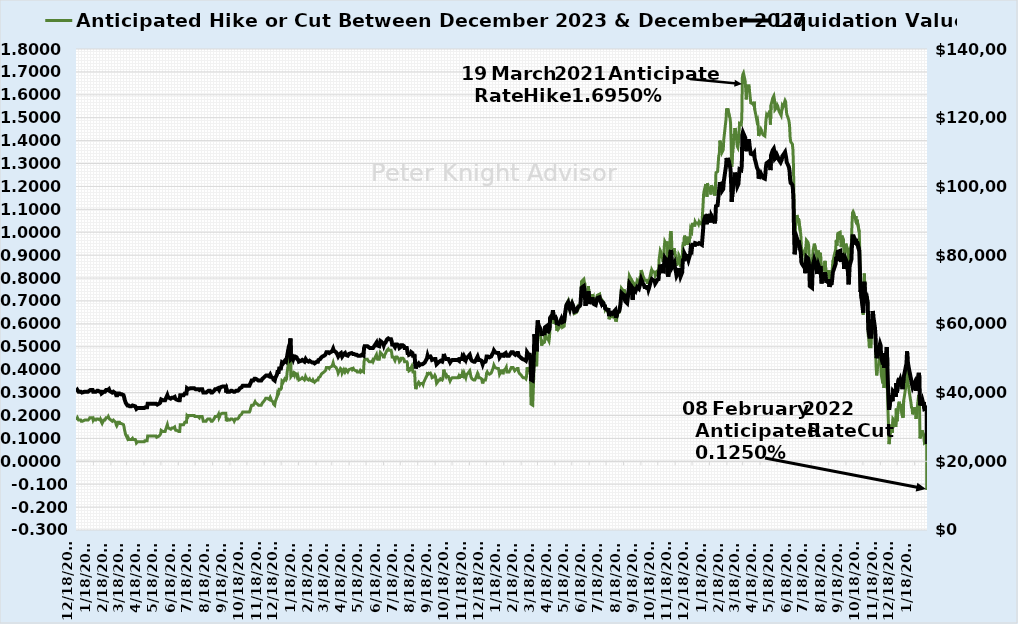
| Category | Anticipated Hike or Cut Between December 2023 & December 2027 |
|---|---|
| 12/18/17 | 0.18 |
| 12/19/17 | 0.18 |
| 12/20/17 | 0.19 |
| 12/21/17 | 0.185 |
| 12/22/17 | 0.18 |
| 12/26/17 | 0.18 |
| 12/27/17 | 0.175 |
| 12/28/17 | 0.175 |
| 12/29/17 | 0.175 |
| 1/2/18 | 0.18 |
| 1/3/18 | 0.18 |
| 1/4/18 | 0.18 |
| 1/5/18 | 0.18 |
| 1/8/18 | 0.18 |
| 1/9/18 | 0.18 |
| 1/10/18 | 0.185 |
| 1/11/18 | 0.19 |
| 1/12/18 | 0.19 |
| 1/16/18 | 0.19 |
| 1/17/18 | 0.18 |
| 1/18/18 | 0.185 |
| 1/19/18 | 0.18 |
| 1/22/18 | 0.18 |
| 1/23/18 | 0.185 |
| 1/24/18 | 0.185 |
| 1/25/18 | 0.185 |
| 1/26/18 | 0.185 |
| 1/29/18 | 0.18 |
| 1/30/18 | 0.185 |
| 1/31/18 | 0.18 |
| 2/1/18 | 0.17 |
| 2/2/18 | 0.165 |
| 2/5/18 | 0.18 |
| 2/6/18 | 0.18 |
| 2/7/18 | 0.18 |
| 2/8/18 | 0.185 |
| 2/9/18 | 0.19 |
| 2/12/18 | 0.19 |
| 2/13/18 | 0.195 |
| 2/14/18 | 0.195 |
| 2/15/18 | 0.185 |
| 2/16/18 | 0.185 |
| 2/20/18 | 0.175 |
| 2/21/18 | 0.175 |
| 2/22/18 | 0.18 |
| 2/23/18 | 0.18 |
| 2/26/18 | 0.17 |
| 2/27/18 | 0.16 |
| 2/28/18 | 0.155 |
| 3/1/18 | 0.16 |
| 3/2/18 | 0.17 |
| 3/5/18 | 0.17 |
| 3/6/18 | 0.165 |
| 3/7/18 | 0.165 |
| 3/8/18 | 0.165 |
| 3/9/18 | 0.165 |
| 3/12/18 | 0.16 |
| 3/13/18 | 0.15 |
| 3/14/18 | 0.135 |
| 3/15/18 | 0.125 |
| 3/16/18 | 0.115 |
| 3/19/18 | 0.1 |
| 3/20/18 | 0.105 |
| 3/21/18 | 0.1 |
| 3/22/18 | 0.095 |
| 3/23/18 | 0.095 |
| 3/26/18 | 0.095 |
| 3/27/18 | 0.095 |
| 3/28/18 | 0.1 |
| 3/29/18 | 0.095 |
| 4/2/18 | 0.095 |
| 4/3/18 | 0.09 |
| 4/4/18 | 0.08 |
| 4/5/18 | 0.08 |
| 4/6/18 | 0.085 |
| 4/9/18 | 0.085 |
| 4/10/18 | 0.085 |
| 4/11/18 | 0.085 |
| 4/12/18 | 0.085 |
| 4/13/18 | 0.085 |
| 4/16/18 | 0.085 |
| 4/17/18 | 0.085 |
| 4/18/18 | 0.085 |
| 4/19/18 | 0.09 |
| 4/20/18 | 0.09 |
| 4/23/18 | 0.09 |
| 4/24/18 | 0.11 |
| 4/25/18 | 0.11 |
| 4/26/18 | 0.11 |
| 4/27/18 | 0.11 |
| 4/30/18 | 0.11 |
| 5/1/18 | 0.11 |
| 5/2/18 | 0.11 |
| 5/3/18 | 0.11 |
| 5/4/18 | 0.11 |
| 5/7/18 | 0.11 |
| 5/8/18 | 0.11 |
| 5/9/18 | 0.11 |
| 5/10/18 | 0.105 |
| 5/11/18 | 0.105 |
| 5/14/18 | 0.11 |
| 5/15/18 | 0.11 |
| 5/16/18 | 0.115 |
| 5/17/18 | 0.12 |
| 5/18/18 | 0.135 |
| 5/21/18 | 0.13 |
| 5/22/18 | 0.13 |
| 5/23/18 | 0.13 |
| 5/24/18 | 0.13 |
| 5/25/18 | 0.13 |
| 5/29/18 | 0.16 |
| 5/30/18 | 0.15 |
| 5/31/18 | 0.145 |
| 6/1/18 | 0.145 |
| 6/4/18 | 0.14 |
| 6/5/18 | 0.14 |
| 6/6/18 | 0.145 |
| 6/7/18 | 0.145 |
| 6/8/18 | 0.145 |
| 6/11/18 | 0.15 |
| 6/12/18 | 0.14 |
| 6/13/18 | 0.135 |
| 6/14/18 | 0.135 |
| 6/15/18 | 0.135 |
| 6/18/18 | 0.13 |
| 6/19/18 | 0.13 |
| 6/20/18 | 0.13 |
| 6/21/18 | 0.16 |
| 6/22/18 | 0.16 |
| 6/25/18 | 0.16 |
| 6/26/18 | 0.16 |
| 6/27/18 | 0.16 |
| 6/28/18 | 0.165 |
| 6/29/18 | 0.17 |
| 7/2/18 | 0.17 |
| 7/3/18 | 0.2 |
| 7/5/18 | 0.195 |
| 7/6/18 | 0.2 |
| 7/9/18 | 0.2 |
| 7/10/18 | 0.2 |
| 7/11/18 | 0.2 |
| 7/12/18 | 0.2 |
| 7/13/18 | 0.2 |
| 7/16/18 | 0.2 |
| 7/17/18 | 0.195 |
| 7/18/18 | 0.195 |
| 7/19/18 | 0.195 |
| 7/20/18 | 0.195 |
| 7/23/18 | 0.195 |
| 7/24/18 | 0.195 |
| 7/25/18 | 0.19 |
| 7/26/18 | 0.195 |
| 7/27/18 | 0.195 |
| 7/30/18 | 0.195 |
| 7/31/18 | 0.195 |
| 8/1/18 | 0.175 |
| 8/2/18 | 0.175 |
| 8/3/18 | 0.175 |
| 8/6/18 | 0.175 |
| 8/7/18 | 0.18 |
| 8/8/18 | 0.18 |
| 8/9/18 | 0.185 |
| 8/10/18 | 0.185 |
| 8/13/18 | 0.185 |
| 8/14/18 | 0.18 |
| 8/15/18 | 0.175 |
| 8/16/18 | 0.175 |
| 8/17/18 | 0.175 |
| 8/20/18 | 0.185 |
| 8/21/18 | 0.185 |
| 8/22/18 | 0.195 |
| 8/23/18 | 0.195 |
| 8/24/18 | 0.195 |
| 8/27/18 | 0.2 |
| 8/28/18 | 0.205 |
| 8/29/18 | 0.19 |
| 8/30/18 | 0.195 |
| 8/31/18 | 0.205 |
| 9/4/18 | 0.21 |
| 9/5/18 | 0.21 |
| 9/6/18 | 0.21 |
| 9/7/18 | 0.21 |
| 9/10/18 | 0.21 |
| 9/11/18 | 0.175 |
| 9/12/18 | 0.19 |
| 9/13/18 | 0.18 |
| 9/14/18 | 0.18 |
| 9/17/18 | 0.18 |
| 9/18/18 | 0.18 |
| 9/19/18 | 0.185 |
| 9/20/18 | 0.185 |
| 9/21/18 | 0.185 |
| 9/24/18 | 0.18 |
| 9/25/18 | 0.175 |
| 9/26/18 | 0.18 |
| 9/27/18 | 0.185 |
| 9/28/18 | 0.185 |
| 10/1/18 | 0.185 |
| 10/2/18 | 0.185 |
| 10/3/18 | 0.19 |
| 10/4/18 | 0.195 |
| 10/5/18 | 0.2 |
| 10/8/18 | 0.205 |
| 10/9/18 | 0.21 |
| 10/10/18 | 0.215 |
| 10/11/18 | 0.215 |
| 10/12/18 | 0.215 |
| 10/15/18 | 0.215 |
| 10/16/18 | 0.215 |
| 10/17/18 | 0.215 |
| 10/18/18 | 0.215 |
| 10/19/18 | 0.215 |
| 10/22/18 | 0.215 |
| 10/23/18 | 0.22 |
| 10/24/18 | 0.23 |
| 10/25/18 | 0.23 |
| 10/26/18 | 0.245 |
| 10/29/18 | 0.245 |
| 10/30/18 | 0.25 |
| 10/31/18 | 0.255 |
| 11/1/18 | 0.26 |
| 11/2/18 | 0.255 |
| 11/5/18 | 0.25 |
| 11/6/18 | 0.25 |
| 11/7/18 | 0.245 |
| 11/8/18 | 0.245 |
| 11/9/18 | 0.245 |
| 11/12/18 | 0.245 |
| 11/13/18 | 0.25 |
| 11/14/18 | 0.255 |
| 11/15/18 | 0.255 |
| 11/16/18 | 0.26 |
| 11/19/18 | 0.27 |
| 11/20/18 | 0.275 |
| 11/21/18 | 0.275 |
| 11/23/18 | 0.275 |
| 11/26/18 | 0.27 |
| 11/27/18 | 0.275 |
| 11/28/18 | 0.28 |
| 11/29/18 | 0.275 |
| 11/30/18 | 0.265 |
| 12/3/18 | 0.26 |
| 12/4/18 | 0.25 |
| 12/5/18 | 0.25 |
| 12/6/18 | 0.245 |
| 12/7/18 | 0.26 |
| 12/10/18 | 0.28 |
| 12/11/18 | 0.295 |
| 12/12/18 | 0.29 |
| 12/13/18 | 0.295 |
| 12/14/18 | 0.315 |
| 12/17/18 | 0.315 |
| 12/18/18 | 0.32 |
| 12/19/18 | 0.35 |
| 12/20/18 | 0.35 |
| 12/21/18 | 0.345 |
| 12/24/18 | 0.36 |
| 12/26/18 | 0.355 |
| 12/27/18 | 0.36 |
| 12/28/18 | 0.385 |
| 12/31/18 | 0.44 |
| 1/2/19 | 0.46 |
| 1/3/19 | 0.49 |
| 1/4/19 | 0.37 |
| 1/7/19 | 0.38 |
| 1/8/19 | 0.37 |
| 1/9/19 | 0.38 |
| 1/10/19 | 0.375 |
| 1/11/19 | 0.385 |
| 1/14/19 | 0.38 |
| 1/15/19 | 0.37 |
| 1/16/19 | 0.375 |
| 1/17/19 | 0.365 |
| 1/18/19 | 0.355 |
| 1/22/19 | 0.36 |
| 1/23/19 | 0.36 |
| 1/24/19 | 0.365 |
| 1/25/19 | 0.365 |
| 1/28/19 | 0.355 |
| 1/29/19 | 0.36 |
| 1/30/19 | 0.37 |
| 1/31/19 | 0.365 |
| 2/1/19 | 0.36 |
| 2/4/19 | 0.355 |
| 2/5/19 | 0.355 |
| 2/6/19 | 0.36 |
| 2/7/19 | 0.355 |
| 2/8/19 | 0.355 |
| 2/11/19 | 0.35 |
| 2/12/19 | 0.355 |
| 2/13/19 | 0.35 |
| 2/14/19 | 0.35 |
| 2/15/19 | 0.345 |
| 2/19/19 | 0.355 |
| 2/20/19 | 0.355 |
| 2/21/19 | 0.355 |
| 2/22/19 | 0.365 |
| 2/25/19 | 0.37 |
| 2/26/19 | 0.375 |
| 2/27/19 | 0.38 |
| 2/28/19 | 0.38 |
| 3/1/19 | 0.385 |
| 3/4/19 | 0.39 |
| 3/5/19 | 0.39 |
| 3/6/19 | 0.395 |
| 3/7/19 | 0.4 |
| 3/8/19 | 0.41 |
| 3/11/19 | 0.41 |
| 3/12/19 | 0.41 |
| 3/13/19 | 0.405 |
| 3/14/19 | 0.41 |
| 3/15/19 | 0.41 |
| 3/18/19 | 0.415 |
| 3/19/19 | 0.415 |
| 3/20/19 | 0.43 |
| 3/21/19 | 0.42 |
| 3/22/19 | 0.415 |
| 3/25/19 | 0.41 |
| 3/26/19 | 0.41 |
| 3/27/19 | 0.4 |
| 3/28/19 | 0.395 |
| 3/29/19 | 0.385 |
| 4/1/19 | 0.4 |
| 4/2/19 | 0.405 |
| 4/3/19 | 0.405 |
| 4/4/19 | 0.4 |
| 4/5/19 | 0.385 |
| 4/8/19 | 0.4 |
| 4/9/19 | 0.395 |
| 4/10/19 | 0.405 |
| 4/11/19 | 0.395 |
| 4/12/19 | 0.4 |
| 4/15/19 | 0.39 |
| 4/16/19 | 0.395 |
| 4/17/19 | 0.4 |
| 4/18/19 | 0.4 |
| 4/22/19 | 0.405 |
| 4/23/19 | 0.4 |
| 4/24/19 | 0.4 |
| 4/25/19 | 0.405 |
| 4/26/19 | 0.4 |
| 4/29/19 | 0.395 |
| 4/30/19 | 0.395 |
| 5/1/19 | 0.395 |
| 5/2/19 | 0.39 |
| 5/3/19 | 0.39 |
| 5/6/19 | 0.39 |
| 5/7/19 | 0.395 |
| 5/8/19 | 0.39 |
| 5/9/19 | 0.39 |
| 5/10/19 | 0.395 |
| 5/13/19 | 0.39 |
| 5/14/19 | 0.435 |
| 5/15/19 | 0.445 |
| 5/16/19 | 0.445 |
| 5/17/19 | 0.445 |
| 5/20/19 | 0.445 |
| 5/21/19 | 0.44 |
| 5/22/19 | 0.44 |
| 5/23/19 | 0.435 |
| 5/24/19 | 0.435 |
| 5/28/19 | 0.435 |
| 5/29/19 | 0.44 |
| 5/30/19 | 0.435 |
| 5/31/19 | 0.44 |
| 6/3/19 | 0.455 |
| 6/4/19 | 0.46 |
| 6/5/19 | 0.465 |
| 6/6/19 | 0.45 |
| 6/7/19 | 0.445 |
| 6/10/19 | 0.445 |
| 6/11/19 | 0.445 |
| 6/12/19 | 0.475 |
| 6/13/19 | 0.475 |
| 6/14/19 | 0.47 |
| 6/17/19 | 0.46 |
| 6/18/19 | 0.45 |
| 6/19/19 | 0.46 |
| 6/20/19 | 0.465 |
| 6/21/19 | 0.465 |
| 6/24/19 | 0.485 |
| 6/25/19 | 0.485 |
| 6/26/19 | 0.49 |
| 6/27/19 | 0.485 |
| 6/28/19 | 0.485 |
| 7/1/19 | 0.485 |
| 7/2/19 | 0.475 |
| 7/3/19 | 0.455 |
| 7/5/19 | 0.455 |
| 7/8/19 | 0.44 |
| 7/9/19 | 0.44 |
| 7/10/19 | 0.455 |
| 7/11/19 | 0.455 |
| 7/12/19 | 0.455 |
| 7/15/19 | 0.445 |
| 7/16/19 | 0.435 |
| 7/17/19 | 0.435 |
| 7/18/19 | 0.44 |
| 7/19/19 | 0.45 |
| 7/22/19 | 0.45 |
| 7/23/19 | 0.45 |
| 7/24/19 | 0.445 |
| 7/25/19 | 0.435 |
| 7/26/19 | 0.435 |
| 7/29/19 | 0.435 |
| 7/30/19 | 0.43 |
| 7/31/19 | 0.395 |
| 8/1/19 | 0.41 |
| 8/2/19 | 0.395 |
| 8/5/19 | 0.4 |
| 8/6/19 | 0.41 |
| 8/7/19 | 0.415 |
| 8/8/19 | 0.405 |
| 8/9/19 | 0.39 |
| 8/12/19 | 0.39 |
| 8/13/19 | 0.335 |
| 8/14/19 | 0.315 |
| 8/15/19 | 0.315 |
| 8/16/19 | 0.335 |
| 8/19/19 | 0.345 |
| 8/20/19 | 0.345 |
| 8/21/19 | 0.335 |
| 8/22/19 | 0.34 |
| 8/23/19 | 0.34 |
| 8/26/19 | 0.34 |
| 8/27/19 | 0.335 |
| 8/28/19 | 0.345 |
| 8/29/19 | 0.35 |
| 8/30/19 | 0.35 |
| 9/3/19 | 0.375 |
| 9/4/19 | 0.39 |
| 9/5/19 | 0.38 |
| 9/6/19 | 0.38 |
| 9/9/19 | 0.385 |
| 9/10/19 | 0.38 |
| 9/11/19 | 0.375 |
| 9/12/19 | 0.365 |
| 9/13/19 | 0.365 |
| 9/16/19 | 0.37 |
| 9/17/19 | 0.375 |
| 9/18/19 | 0.37 |
| 9/19/19 | 0.355 |
| 9/20/19 | 0.34 |
| 9/23/19 | 0.35 |
| 9/24/19 | 0.355 |
| 9/25/19 | 0.355 |
| 9/26/19 | 0.355 |
| 9/27/19 | 0.36 |
| 9/30/19 | 0.355 |
| 10/1/19 | 0.36 |
| 10/2/19 | 0.375 |
| 10/3/19 | 0.4 |
| 10/4/19 | 0.385 |
| 10/7/19 | 0.37 |
| 10/8/19 | 0.375 |
| 10/9/19 | 0.37 |
| 10/10/19 | 0.37 |
| 10/11/19 | 0.37 |
| 10/14/19 | 0.35 |
| 10/15/19 | 0.35 |
| 10/16/19 | 0.36 |
| 10/17/19 | 0.36 |
| 10/18/19 | 0.365 |
| 10/21/19 | 0.365 |
| 10/22/19 | 0.365 |
| 10/23/19 | 0.365 |
| 10/24/19 | 0.365 |
| 10/25/19 | 0.365 |
| 10/28/19 | 0.365 |
| 10/29/19 | 0.37 |
| 10/30/19 | 0.36 |
| 10/31/19 | 0.38 |
| 11/1/19 | 0.37 |
| 11/4/19 | 0.37 |
| 11/5/19 | 0.385 |
| 11/6/19 | 0.38 |
| 11/7/19 | 0.375 |
| 11/8/19 | 0.385 |
| 11/11/19 | 0.365 |
| 11/12/19 | 0.375 |
| 11/13/19 | 0.38 |
| 11/14/19 | 0.38 |
| 11/15/19 | 0.385 |
| 11/18/19 | 0.395 |
| 11/19/19 | 0.385 |
| 11/20/19 | 0.37 |
| 11/21/19 | 0.37 |
| 11/22/19 | 0.36 |
| 11/25/19 | 0.355 |
| 11/26/19 | 0.355 |
| 11/27/19 | 0.355 |
| 11/29/19 | 0.365 |
| 12/2/19 | 0.385 |
| 12/3/19 | 0.38 |
| 12/4/19 | 0.365 |
| 12/5/19 | 0.365 |
| 12/6/19 | 0.365 |
| 12/9/19 | 0.36 |
| 12/10/19 | 0.35 |
| 12/11/19 | 0.34 |
| 12/12/19 | 0.35 |
| 12/13/19 | 0.355 |
| 12/16/19 | 0.355 |
| 12/17/19 | 0.365 |
| 12/18/19 | 0.385 |
| 12/19/19 | 0.39 |
| 12/20/19 | 0.385 |
| 12/23/19 | 0.38 |
| 12/24/19 | 0.38 |
| 12/26/19 | 0.385 |
| 12/27/19 | 0.39 |
| 12/30/19 | 0.41 |
| 12/31/19 | 0.42 |
| 1/2/20 | 0.41 |
| 1/3/20 | 0.41 |
| 1/6/20 | 0.405 |
| 1/7/20 | 0.405 |
| 1/8/20 | 0.405 |
| 1/9/20 | 0.395 |
| 1/10/20 | 0.38 |
| 1/13/20 | 0.395 |
| 1/14/20 | 0.395 |
| 1/15/20 | 0.395 |
| 1/16/20 | 0.38 |
| 1/17/20 | 0.395 |
| 1/21/20 | 0.405 |
| 1/22/20 | 0.41 |
| 1/23/20 | 0.39 |
| 1/24/20 | 0.39 |
| 1/27/20 | 0.39 |
| 1/28/20 | 0.395 |
| 1/29/20 | 0.4 |
| 1/30/20 | 0.405 |
| 1/31/20 | 0.41 |
| 2/3/20 | 0.41 |
| 2/4/20 | 0.405 |
| 2/5/20 | 0.4 |
| 2/6/20 | 0.395 |
| 2/7/20 | 0.395 |
| 2/10/20 | 0.405 |
| 2/11/20 | 0.405 |
| 2/12/20 | 0.405 |
| 2/13/20 | 0.39 |
| 2/14/20 | 0.385 |
| 2/18/20 | 0.375 |
| 2/19/20 | 0.37 |
| 2/20/20 | 0.37 |
| 2/21/20 | 0.365 |
| 2/24/20 | 0.365 |
| 2/25/20 | 0.365 |
| 2/26/20 | 0.36 |
| 2/27/20 | 0.37 |
| 2/28/20 | 0.41 |
| 3/2/20 | 0.395 |
| 3/3/20 | 0.395 |
| 3/4/20 | 0.395 |
| 3/5/20 | 0.38 |
| 3/6/20 | 0.25 |
| 3/9/20 | 0.245 |
| 3/10/20 | 0.305 |
| 3/11/20 | 0.38 |
| 3/12/20 | 0.515 |
| 3/13/20 | 0.5 |
| 3/16/20 | 0.415 |
| 3/17/20 | 0.55 |
| 3/18/20 | 0.595 |
| 3/19/20 | 0.57 |
| 3/20/20 | 0.57 |
| 3/23/20 | 0.545 |
| 3/24/20 | 0.525 |
| 3/25/20 | 0.505 |
| 3/26/20 | 0.52 |
| 3/27/20 | 0.515 |
| 3/30/20 | 0.52 |
| 3/31/20 | 0.555 |
| 4/1/20 | 0.56 |
| 4/2/20 | 0.56 |
| 4/3/20 | 0.535 |
| 4/6/20 | 0.53 |
| 4/7/20 | 0.525 |
| 4/8/20 | 0.545 |
| 4/9/20 | 0.61 |
| 4/13/20 | 0.63 |
| 4/14/20 | 0.655 |
| 4/15/20 | 0.62 |
| 4/16/20 | 0.6 |
| 4/17/20 | 0.625 |
| 4/20/20 | 0.6 |
| 4/21/20 | 0.57 |
| 4/22/20 | 0.58 |
| 4/23/20 | 0.575 |
| 4/24/20 | 0.575 |
| 4/27/20 | 0.59 |
| 4/28/20 | 0.59 |
| 4/29/20 | 0.605 |
| 4/30/20 | 0.6 |
| 5/1/20 | 0.585 |
| 5/4/20 | 0.59 |
| 5/5/20 | 0.59 |
| 5/6/20 | 0.645 |
| 5/7/20 | 0.65 |
| 5/8/20 | 0.685 |
| 5/11/20 | 0.7 |
| 5/12/20 | 0.685 |
| 5/13/20 | 0.67 |
| 5/14/20 | 0.66 |
| 5/15/20 | 0.675 |
| 5/18/20 | 0.695 |
| 5/19/20 | 0.695 |
| 5/20/20 | 0.68 |
| 5/21/20 | 0.66 |
| 5/22/20 | 0.645 |
| 5/26/20 | 0.65 |
| 5/27/20 | 0.65 |
| 5/28/20 | 0.67 |
| 5/29/20 | 0.665 |
| 6/1/20 | 0.68 |
| 6/2/20 | 0.69 |
| 6/3/20 | 0.74 |
| 6/4/20 | 0.785 |
| 6/5/20 | 0.785 |
| 6/8/20 | 0.795 |
| 6/9/20 | 0.78 |
| 6/10/20 | 0.775 |
| 6/11/20 | 0.68 |
| 6/12/20 | 0.72 |
| 6/15/20 | 0.725 |
| 6/16/20 | 0.765 |
| 6/17/20 | 0.74 |
| 6/18/20 | 0.69 |
| 6/19/20 | 0.705 |
| 6/22/20 | 0.71 |
| 6/23/20 | 0.73 |
| 6/24/20 | 0.71 |
| 6/25/20 | 0.715 |
| 6/26/20 | 0.69 |
| 6/29/20 | 0.685 |
| 6/30/20 | 0.7 |
| 7/1/20 | 0.715 |
| 7/2/20 | 0.725 |
| 7/6/20 | 0.73 |
| 7/7/20 | 0.71 |
| 7/8/20 | 0.705 |
| 7/9/20 | 0.695 |
| 7/10/20 | 0.705 |
| 7/13/20 | 0.695 |
| 7/14/20 | 0.675 |
| 7/15/20 | 0.685 |
| 7/16/20 | 0.665 |
| 7/17/20 | 0.67 |
| 7/20/20 | 0.655 |
| 7/21/20 | 0.66 |
| 7/22/20 | 0.655 |
| 7/23/20 | 0.62 |
| 7/24/20 | 0.63 |
| 7/27/20 | 0.635 |
| 7/28/20 | 0.625 |
| 7/29/20 | 0.65 |
| 7/30/20 | 0.64 |
| 7/31/20 | 0.635 |
| 8/3/20 | 0.655 |
| 8/4/20 | 0.61 |
| 8/5/20 | 0.615 |
| 8/6/20 | 0.63 |
| 8/7/20 | 0.645 |
| 8/10/20 | 0.65 |
| 8/11/20 | 0.665 |
| 8/12/20 | 0.685 |
| 8/13/20 | 0.72 |
| 8/14/20 | 0.755 |
| 8/17/20 | 0.745 |
| 8/18/20 | 0.73 |
| 8/19/20 | 0.75 |
| 8/20/20 | 0.715 |
| 8/21/20 | 0.705 |
| 8/24/20 | 0.695 |
| 8/25/20 | 0.72 |
| 8/26/20 | 0.715 |
| 8/27/20 | 0.78 |
| 8/28/20 | 0.81 |
| 8/31/20 | 0.795 |
| 9/1/20 | 0.765 |
| 9/2/20 | 0.74 |
| 9/3/20 | 0.715 |
| 9/4/20 | 0.78 |
| 9/8/20 | 0.765 |
| 9/9/20 | 0.775 |
| 9/10/20 | 0.78 |
| 9/11/20 | 0.79 |
| 9/14/20 | 0.78 |
| 9/15/20 | 0.785 |
| 9/16/20 | 0.805 |
| 9/17/20 | 0.81 |
| 9/18/20 | 0.835 |
| 9/21/20 | 0.81 |
| 9/22/20 | 0.81 |
| 9/23/20 | 0.8 |
| 9/24/20 | 0.79 |
| 9/25/20 | 0.79 |
| 9/28/20 | 0.79 |
| 9/29/20 | 0.775 |
| 9/30/20 | 0.79 |
| 10/1/20 | 0.775 |
| 10/2/20 | 0.785 |
| 10/5/20 | 0.82 |
| 10/6/20 | 0.815 |
| 10/7/20 | 0.835 |
| 10/8/20 | 0.83 |
| 10/9/20 | 0.83 |
| 10/12/20 | 0.825 |
| 10/13/20 | 0.81 |
| 10/14/20 | 0.81 |
| 10/15/20 | 0.82 |
| 10/16/20 | 0.83 |
| 10/19/20 | 0.835 |
| 10/20/20 | 0.885 |
| 10/21/20 | 0.9 |
| 10/22/20 | 0.92 |
| 10/23/20 | 0.915 |
| 10/26/20 | 0.885 |
| 10/27/20 | 0.87 |
| 10/28/20 | 0.885 |
| 10/29/20 | 0.935 |
| 10/30/20 | 0.96 |
| 11/2/20 | 0.945 |
| 11/3/20 | 0.96 |
| 11/4/20 | 0.865 |
| 11/5/20 | 0.85 |
| 11/6/20 | 0.87 |
| 11/9/20 | 0.995 |
| 11/10/20 | 1.005 |
| 11/11/20 | 0.975 |
| 11/12/20 | 0.905 |
| 11/13/20 | 0.91 |
| 11/16/20 | 0.93 |
| 11/17/20 | 0.905 |
| 11/18/20 | 0.9 |
| 11/19/20 | 0.875 |
| 11/20/20 | 0.855 |
| 11/23/20 | 0.875 |
| 11/24/20 | 0.9 |
| 11/25/20 | 0.895 |
| 11/27/20 | 0.85 |
| 11/30/20 | 0.875 |
| 12/1/20 | 0.94 |
| 12/2/20 | 0.955 |
| 12/3/20 | 0.94 |
| 12/4/20 | 0.985 |
| 12/7/20 | 0.965 |
| 12/8/20 | 0.945 |
| 12/9/20 | 0.98 |
| 12/10/20 | 0.955 |
| 12/11/20 | 0.945 |
| 12/14/20 | 0.98 |
| 12/15/20 | 1.015 |
| 12/16/20 | 1.01 |
| 12/17/20 | 1.005 |
| 12/18/20 | 1.035 |
| 12/21/20 | 1.035 |
| 12/22/20 | 1.025 |
| 12/23/20 | 1.045 |
| 12/24/20 | 1.04 |
| 12/28/20 | 1.04 |
| 12/29/20 | 1.035 |
| 12/30/20 | 1.045 |
| 12/31/20 | 1.04 |
| 1/4/21 | 1.035 |
| 1/5/21 | 1.075 |
| 1/6/21 | 1.115 |
| 1/7/21 | 1.165 |
| 1/8/21 | 1.18 |
| 1/11/21 | 1.21 |
| 1/12/21 | 1.19 |
| 1/13/21 | 1.155 |
| 1/14/21 | 1.215 |
| 1/15/21 | 1.195 |
| 1/19/21 | 1.185 |
| 1/20/21 | 1.165 |
| 1/21/21 | 1.205 |
| 1/22/21 | 1.205 |
| 1/25/21 | 1.18 |
| 1/26/21 | 1.18 |
| 1/27/21 | 1.16 |
| 1/28/21 | 1.185 |
| 1/29/21 | 1.26 |
| 2/1/21 | 1.265 |
| 2/2/21 | 1.3 |
| 2/3/21 | 1.335 |
| 2/4/21 | 1.34 |
| 2/5/21 | 1.4 |
| 2/8/21 | 1.375 |
| 2/9/21 | 1.35 |
| 2/10/21 | 1.35 |
| 2/11/21 | 1.36 |
| 2/12/21 | 1.405 |
| 2/16/21 | 1.495 |
| 2/17/21 | 1.54 |
| 2/18/21 | 1.525 |
| 2/19/21 | 1.54 |
| 2/22/21 | 1.505 |
| 2/23/21 | 1.5 |
| 2/24/21 | 1.475 |
| 2/25/21 | 1.395 |
| 2/26/21 | 1.285 |
| 3/1/21 | 1.395 |
| 3/2/21 | 1.43 |
| 3/3/21 | 1.415 |
| 3/4/21 | 1.455 |
| 3/5/21 | 1.44 |
| 3/8/21 | 1.375 |
| 3/9/21 | 1.37 |
| 3/10/21 | 1.39 |
| 3/11/21 | 1.39 |
| 3/12/21 | 1.475 |
| 3/15/21 | 1.47 |
| 3/16/21 | 1.495 |
| 3/17/21 | 1.675 |
| 3/18/21 | 1.69 |
| 3/19/21 | 1.695 |
| 3/22/21 | 1.66 |
| 3/23/21 | 1.625 |
| 3/24/21 | 1.58 |
| 3/25/21 | 1.63 |
| 3/26/21 | 1.64 |
| 3/29/21 | 1.64 |
| 3/30/21 | 1.61 |
| 3/31/21 | 1.61 |
| 4/1/21 | 1.565 |
| 4/5/21 | 1.56 |
| 4/6/21 | 1.555 |
| 4/7/21 | 1.57 |
| 4/8/21 | 1.535 |
| 4/9/21 | 1.525 |
| 4/12/21 | 1.485 |
| 4/13/21 | 1.49 |
| 4/14/21 | 1.47 |
| 4/15/21 | 1.42 |
| 4/16/21 | 1.42 |
| 4/19/21 | 1.45 |
| 4/20/21 | 1.445 |
| 4/21/21 | 1.435 |
| 4/22/21 | 1.435 |
| 4/23/21 | 1.425 |
| 4/26/21 | 1.42 |
| 4/27/21 | 1.45 |
| 4/28/21 | 1.49 |
| 4/29/21 | 1.51 |
| 4/30/21 | 1.505 |
| 5/3/21 | 1.52 |
| 5/4/21 | 1.515 |
| 5/5/21 | 1.505 |
| 5/6/21 | 1.47 |
| 5/7/21 | 1.555 |
| 5/10/21 | 1.585 |
| 5/11/21 | 1.585 |
| 5/12/21 | 1.595 |
| 5/13/21 | 1.58 |
| 5/14/21 | 1.535 |
| 5/17/21 | 1.545 |
| 5/18/21 | 1.555 |
| 5/19/21 | 1.55 |
| 5/20/21 | 1.54 |
| 5/21/21 | 1.53 |
| 5/24/21 | 1.515 |
| 5/25/21 | 1.51 |
| 5/26/21 | 1.53 |
| 5/27/21 | 1.55 |
| 5/28/21 | 1.545 |
| 6/1/21 | 1.575 |
| 6/2/21 | 1.57 |
| 6/3/21 | 1.54 |
| 6/4/21 | 1.515 |
| 6/7/21 | 1.495 |
| 6/8/21 | 1.485 |
| 6/9/21 | 1.465 |
| 6/10/21 | 1.415 |
| 6/11/21 | 1.395 |
| 6/14/21 | 1.385 |
| 6/15/21 | 1.36 |
| 6/16/21 | 1.285 |
| 6/17/21 | 1.105 |
| 6/18/21 | 0.98 |
| 6/21/21 | 1.06 |
| 6/22/21 | 1.075 |
| 6/23/21 | 1.065 |
| 6/24/21 | 1.04 |
| 6/25/21 | 1.06 |
| 6/28/21 | 1.005 |
| 6/29/21 | 0.99 |
| 6/30/21 | 0.935 |
| 7/1/21 | 0.925 |
| 7/2/21 | 0.92 |
| 7/6/21 | 0.9 |
| 7/7/21 | 0.87 |
| 7/8/21 | 0.935 |
| 7/9/21 | 0.965 |
| 7/12/21 | 0.955 |
| 7/13/21 | 0.94 |
| 7/14/21 | 0.895 |
| 7/15/21 | 0.795 |
| 7/16/21 | 0.795 |
| 7/19/21 | 0.785 |
| 7/20/21 | 0.89 |
| 7/21/21 | 0.925 |
| 7/22/21 | 0.935 |
| 7/23/21 | 0.95 |
| 7/26/21 | 0.92 |
| 7/27/21 | 0.905 |
| 7/28/21 | 0.865 |
| 7/29/21 | 0.905 |
| 7/30/21 | 0.92 |
| 8/2/21 | 0.89 |
| 8/3/21 | 0.91 |
| 8/4/21 | 0.85 |
| 8/5/21 | 0.81 |
| 8/6/21 | 0.85 |
| 8/9/21 | 0.845 |
| 8/10/21 | 0.83 |
| 8/11/21 | 0.875 |
| 8/12/21 | 0.875 |
| 8/13/21 | 0.825 |
| 8/16/21 | 0.825 |
| 8/17/21 | 0.81 |
| 8/18/21 | 0.835 |
| 8/19/21 | 0.79 |
| 8/20/21 | 0.805 |
| 8/23/21 | 0.81 |
| 8/24/21 | 0.84 |
| 8/25/21 | 0.875 |
| 8/26/21 | 0.88 |
| 8/27/21 | 0.895 |
| 8/30/21 | 0.925 |
| 8/31/21 | 0.965 |
| 9/1/21 | 0.94 |
| 9/2/21 | 0.94 |
| 9/3/21 | 0.995 |
| 9/7/21 | 1 |
| 9/8/21 | 0.96 |
| 9/9/21 | 0.935 |
| 9/10/21 | 0.985 |
| 9/13/21 | 0.965 |
| 9/14/21 | 0.895 |
| 9/15/21 | 0.91 |
| 9/16/21 | 0.915 |
| 9/17/21 | 0.95 |
| 9/20/21 | 0.925 |
| 9/21/21 | 0.93 |
| 9/22/21 | 0.805 |
| 9/23/21 | 0.85 |
| 9/24/21 | 0.915 |
| 9/27/21 | 0.95 |
| 9/28/21 | 1.03 |
| 9/29/21 | 1.085 |
| 9/30/21 | 1.09 |
| 10/1/21 | 1.085 |
| 10/4/21 | 1.06 |
| 10/5/21 | 1.07 |
| 10/6/21 | 1.035 |
| 10/7/21 | 1.055 |
| 10/8/21 | 1.055 |
| 10/11/21 | 1 |
| 10/12/21 | 0.905 |
| 10/13/21 | 0.76 |
| 10/14/21 | 0.77 |
| 10/15/21 | 0.725 |
| 10/18/21 | 0.64 |
| 10/19/21 | 0.77 |
| 10/20/21 | 0.82 |
| 10/21/21 | 0.76 |
| 10/22/21 | 0.695 |
| 10/25/21 | 0.72 |
| 10/26/21 | 0.7 |
| 10/27/21 | 0.545 |
| 10/28/21 | 0.55 |
| 10/29/21 | 0.5 |
| 11/1/21 | 0.5 |
| 11/2/21 | 0.6 |
| 11/3/21 | 0.575 |
| 11/4/21 | 0.65 |
| 11/5/21 | 0.62 |
| 11/8/21 | 0.55 |
| 11/9/21 | 0.5 |
| 11/10/21 | 0.41 |
| 11/11/21 | 0.375 |
| 11/12/21 | 0.4 |
| 11/15/21 | 0.43 |
| 11/16/21 | 0.445 |
| 11/17/21 | 0.46 |
| 11/18/21 | 0.45 |
| 11/19/21 | 0.38 |
| 11/22/21 | 0.34 |
| 11/23/21 | 0.405 |
| 11/24/21 | 0.32 |
| 11/26/21 | 0.355 |
| 11/29/21 | 0.44 |
| 11/30/21 | 0.33 |
| 12/1/21 | 0.225 |
| 12/2/21 | 0.155 |
| 12/3/21 | 0.075 |
| 12/6/21 | 0.145 |
| 12/7/21 | 0.13 |
| 12/8/21 | 0.16 |
| 12/9/21 | 0.125 |
| 12/10/21 | 0.185 |
| 12/13/21 | 0.175 |
| 12/14/21 | 0.165 |
| 12/15/21 | 0.15 |
| 12/16/21 | 0.23 |
| 12/17/21 | 0.175 |
| 12/20/21 | 0.25 |
| 12/21/21 | 0.26 |
| 12/22/21 | 0.24 |
| 12/23/21 | 0.25 |
| 12/27/21 | 0.195 |
| 12/28/21 | 0.19 |
| 12/29/21 | 0.265 |
| 12/30/21 | 0.28 |
| 12/31/21 | 0.28 |
| 1/3/22 | 0.345 |
| 1/4/22 | 0.415 |
| 1/5/22 | 0.365 |
| 1/6/22 | 0.34 |
| 1/7/22 | 0.32 |
| 1/10/22 | 0.27 |
| 1/11/22 | 0.255 |
| 1/12/22 | 0.235 |
| 1/13/22 | 0.23 |
| 1/14/22 | 0.205 |
| 1/18/22 | 0.235 |
| 1/19/22 | 0.22 |
| 1/20/22 | 0.185 |
| 1/21/22 | 0.205 |
| 1/24/22 | 0.275 |
| 1/25/22 | 0.29 |
| 1/26/22 | 0.26 |
| 1/27/22 | 0.1 |
| 1/28/22 | 0.1 |
| 1/31/22 | 0.135 |
| 2/1/22 | 0.135 |
| 2/2/22 | 0.11 |
| 2/3/22 | 0.12 |
| 2/4/22 | 0.08 |
| 2/7/22 | 0.085 |
| 2/8/22 | 0.07 |
| 2/8/22 | -0.125 |